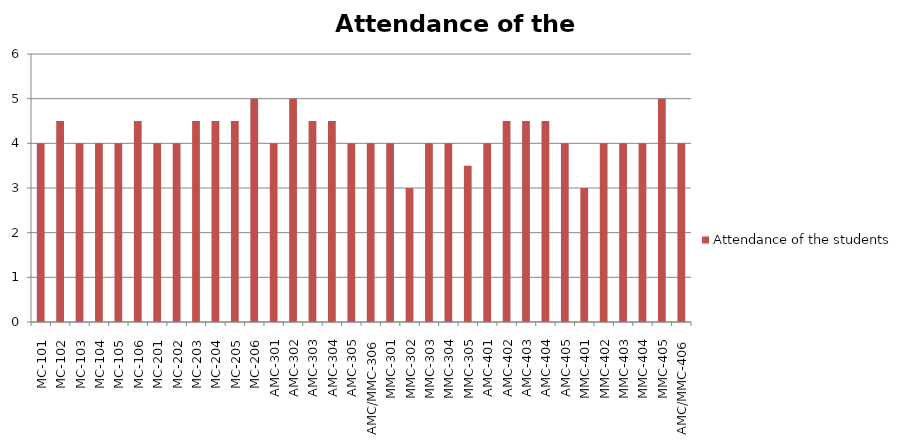
| Category | Attendance of the students |
|---|---|
| MC-101 | 4 |
| MC-102 | 4.5 |
| MC-103 | 4 |
| MC-104 | 4 |
| MC-105 | 4 |
| MC-106 | 4.5 |
| MC-201 | 4 |
| MC-202 | 4 |
| MC-203 | 4.5 |
| MC-204 | 4.5 |
| MC-205 | 4.5 |
| MC-206 | 5 |
| AMC-301 | 4 |
| AMC-302 | 5 |
| AMC-303 | 4.5 |
| AMC-304 | 4.5 |
| AMC-305 | 4 |
| AMC/MMC-306 | 4 |
| MMC-301 | 4 |
| MMC-302 | 3 |
| MMC-303 | 4 |
| MMC-304 | 4 |
| MMC-305 | 3.5 |
| AMC-401 | 4 |
| AMC-402 | 4.5 |
| AMC-403 | 4.5 |
| AMC-404 | 4.5 |
| AMC-405 | 4 |
| MMC-401 | 3 |
| MMC-402 | 4 |
| MMC-403 | 4 |
| MMC-404 | 4 |
| MMC-405 | 5 |
| AMC/MMC-406 | 4 |